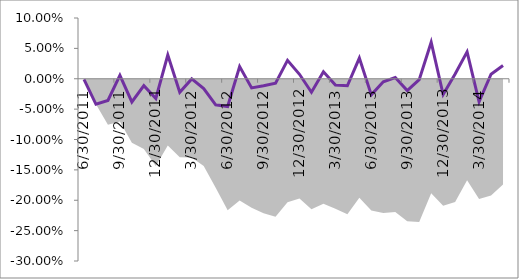
| Category | Series 1 |
|---|---|
| 0 | -0.001 |
| 01/01/1900 | -0.042 |
| 02/01/1900 | -0.036 |
| 03/01/1900 | 0.006 |
| 04/01/1900 | -0.038 |
| 05/01/1900 | -0.011 |
| 06/01/1900 | -0.032 |
| 07/01/1900 | 0.039 |
| 08/01/1900 | -0.022 |
| 09/01/1900 | 0 |
| 10/01/1900 | -0.016 |
| 11/01/1900 | -0.043 |
| 12/01/1900 | -0.046 |
| 13/01/1900 | 0.02 |
| 14/01/1900 | -0.015 |
| 15/01/1900 | -0.011 |
| 16/01/1900 | -0.007 |
| 17/01/1900 | 0.03 |
| 18/01/1900 | 0.007 |
| 19/01/1900 | -0.022 |
| 20/01/1900 | 0.011 |
| 21/01/1900 | -0.01 |
| 22/01/1900 | -0.012 |
| 23/01/1900 | 0.034 |
| 24/01/1900 | -0.026 |
| 25/01/1900 | -0.005 |
| 26/01/1900 | 0.002 |
| 27/01/1900 | -0.019 |
| 28/01/1900 | -0.002 |
| 29/01/1900 | 0.06 |
| 30/01/1900 | -0.026 |
| 31/01/1900 | 0.008 |
| 01/02/1900 | 0.044 |
| 02/02/1900 | -0.038 |
| 03/02/1900 | 0.007 |
| 04/02/1900 | 0.022 |